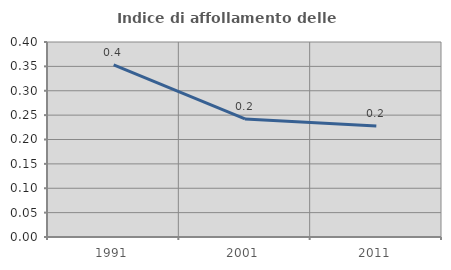
| Category | Indice di affollamento delle abitazioni  |
|---|---|
| 1991.0 | 0.353 |
| 2001.0 | 0.242 |
| 2011.0 | 0.228 |